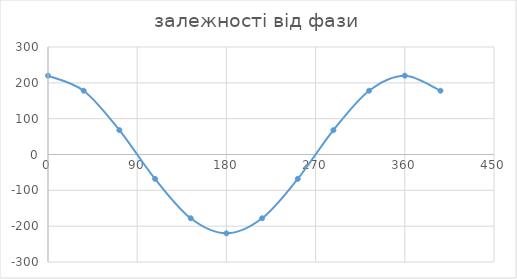
| Category | Series 0 |
|---|---|
| 0.0 | 220 |
| 36.0 | 177.984 |
| 72.0 | 67.984 |
| 108.0 | -67.984 |
| 143.99999999999997 | -177.984 |
| 179.99999999999994 | -220 |
| 215.99999999999991 | -177.984 |
| 251.99999999999991 | -67.984 |
| 287.99999999999983 | 67.984 |
| 323.99999999999983 | 177.984 |
| 359.9999999999997 | 220 |
| 395.99999999999966 | 177.984 |